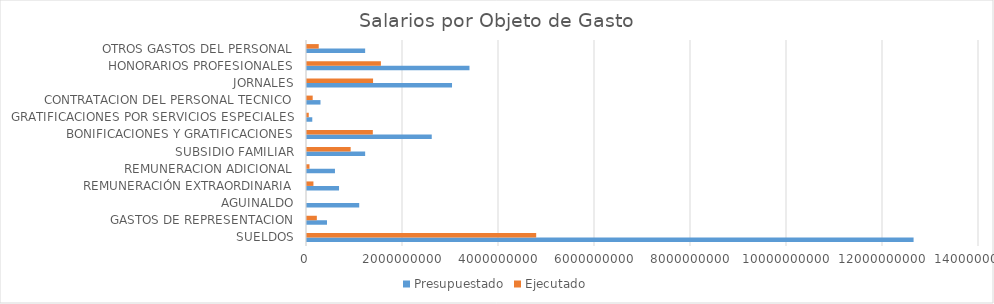
| Category | Presupuestado | Ejecutado |
|---|---|---|
| SUELDOS | 12637200000 | 4774876790 |
| GASTOS DE REPRESENTACION | 416148000 | 205017400 |
| AGUINALDO | 1087779000 | 0 |
| REMUNERACIÓN EXTRAORDINARIA | 667333416 | 133998657 |
| REMUNERACION ADICIONAL | 582677808 | 51948424 |
| SUBSIDIO FAMILIAR | 1211500536 | 909508480 |
| BONIFICACIONES Y GRATIFICACIONES | 2598893700 | 1371460007 |
| GRATIFICACIONES POR SERVICIOS ESPECIALES | 110000000 | 36720000 |
| CONTRATACION DEL PERSONAL TECNICO | 281003000 | 118560045 |
| JORNALES | 3021302064 | 1376396612 |
| HONORARIOS PROFESIONALES | 3384868488 | 1539906764 |
| OTROS GASTOS DEL PERSONAL | 1211428549 | 244464047 |